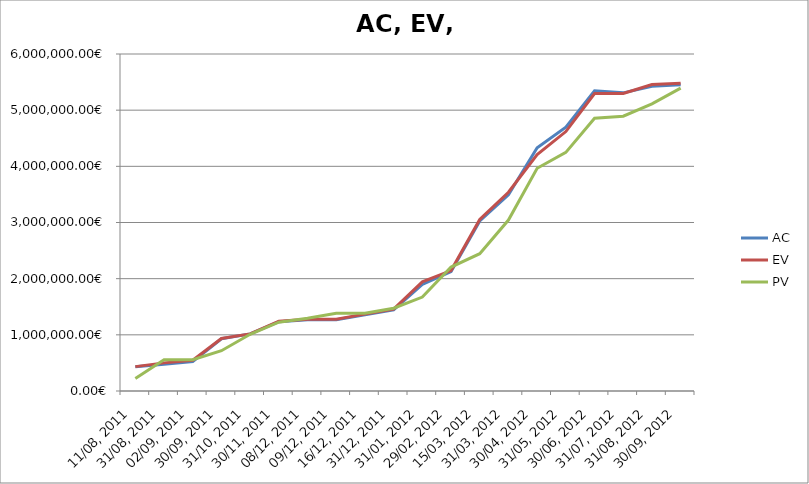
| Category | AC | EV | PV |
|---|---|---|---|
| 11/08, 2011 | 433762.439 | 433762.439 | 222522.908 |
| 31/08, 2011 | 477009.22 | 500660.041 | 556096.508 |
| 02/09, 2011 | 524326.979 | 547862.849 | 556801.308 |
| 30/09, 2011 | 929878.456 | 935376.106 | 716853.79 |
| 31/10, 2011 | 1016558.194 | 1017323.684 | 1010196.707 |
| 30/11, 2011 | 1233100.802 | 1243036.062 | 1225065.266 |
| 08/12, 2011 | 1267876.432 | 1278757.501 | 1293750.643 |
| 09/12, 2011 | 1267876.432 | 1278757.501 | 1383558.12 |
| 16/12, 2011 | 1357684.798 | 1368564.978 | 1383558.12 |
| 31/12, 2011 | 1443590.075 | 1458372.454 | 1473365.596 |
| 31/01, 2012 | 1896956.581 | 1944309.52 | 1672259.443 |
| 29/02, 2012 | 2124144.442 | 2144138.294 | 2206828.532 |
| 15/03, 2012 | 3028512.459 | 3052817.298 | 2444846.728 |
| 31/03, 2012 | 3494943.746 | 3538728.715 | 3043593.288 |
| 30/04, 2012 | 4329939.716 | 4207920.947 | 3964948.002 |
| 31/05, 2012 | 4695563.052 | 4619140.601 | 4247568.795 |
| 30/06, 2012 | 5343006.705 | 5295682.124 | 4857170.149 |
| 31/07, 2012 | 5308149.873 | 5297282.044 | 4891780.839 |
| 31/08, 2012 | 5426562.143 | 5456053.053 | 5112545.801 |
| 30/09, 2012 | 5451028.003 | 5480518.913 | 5392111.244 |